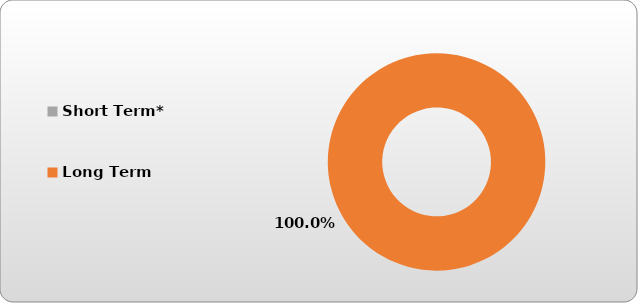
| Category | Short Term* |
|---|---|
| Short Term* | 0 |
| Long Term | 46440.049 |